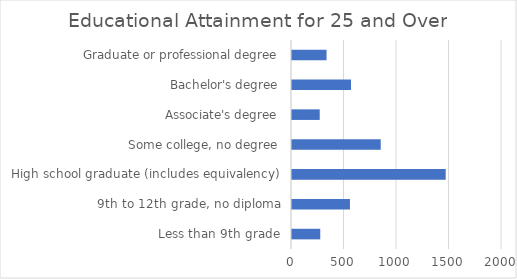
| Category | Series 0 |
|---|---|
| Less than 9th grade | 269 |
| 9th to 12th grade, no diploma | 552 |
| High school graduate (includes equivalency) | 1464 |
| Some college, no degree | 845 |
| Associate's degree | 264 |
| Bachelor's degree | 562 |
| Graduate or professional degree | 329 |